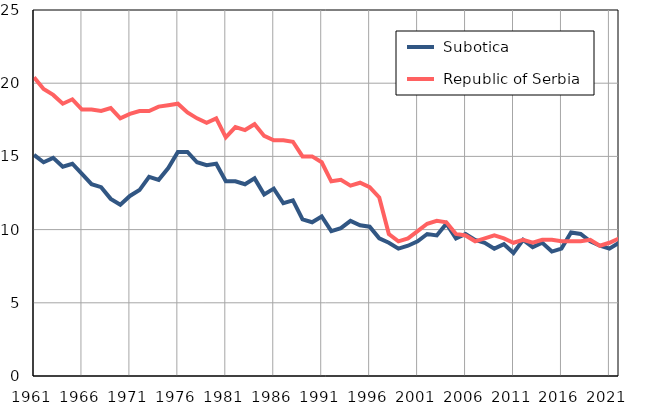
| Category |  Subotica |  Republic of Serbia |
|---|---|---|
| 1961.0 | 15.1 | 20.4 |
| 1962.0 | 14.6 | 19.6 |
| 1963.0 | 14.9 | 19.2 |
| 1964.0 | 14.3 | 18.6 |
| 1965.0 | 14.5 | 18.9 |
| 1966.0 | 13.8 | 18.2 |
| 1967.0 | 13.1 | 18.2 |
| 1968.0 | 12.9 | 18.1 |
| 1969.0 | 12.1 | 18.3 |
| 1970.0 | 11.7 | 17.6 |
| 1971.0 | 12.3 | 17.9 |
| 1972.0 | 12.7 | 18.1 |
| 1973.0 | 13.6 | 18.1 |
| 1974.0 | 13.4 | 18.4 |
| 1975.0 | 14.2 | 18.5 |
| 1976.0 | 15.3 | 18.6 |
| 1977.0 | 15.3 | 18 |
| 1978.0 | 14.6 | 17.6 |
| 1979.0 | 14.4 | 17.3 |
| 1980.0 | 14.5 | 17.6 |
| 1981.0 | 13.3 | 16.3 |
| 1982.0 | 13.3 | 17 |
| 1983.0 | 13.1 | 16.8 |
| 1984.0 | 13.5 | 17.2 |
| 1985.0 | 12.4 | 16.4 |
| 1986.0 | 12.8 | 16.1 |
| 1987.0 | 11.8 | 16.1 |
| 1988.0 | 12 | 16 |
| 1989.0 | 10.7 | 15 |
| 1990.0 | 10.5 | 15 |
| 1991.0 | 10.9 | 14.6 |
| 1992.0 | 9.9 | 13.3 |
| 1993.0 | 10.1 | 13.4 |
| 1994.0 | 10.6 | 13 |
| 1995.0 | 10.3 | 13.2 |
| 1996.0 | 10.2 | 12.9 |
| 1997.0 | 9.4 | 12.2 |
| 1998.0 | 9.1 | 9.7 |
| 1999.0 | 8.7 | 9.2 |
| 2000.0 | 8.9 | 9.4 |
| 2001.0 | 9.2 | 9.9 |
| 2002.0 | 9.7 | 10.4 |
| 2003.0 | 9.6 | 10.6 |
| 2004.0 | 10.4 | 10.5 |
| 2005.0 | 9.4 | 9.7 |
| 2006.0 | 9.7 | 9.6 |
| 2007.0 | 9.3 | 9.2 |
| 2008.0 | 9.1 | 9.4 |
| 2009.0 | 8.7 | 9.6 |
| 2010.0 | 9 | 9.4 |
| 2011.0 | 8.4 | 9.1 |
| 2012.0 | 9.3 | 9.3 |
| 2013.0 | 8.8 | 9.1 |
| 2014.0 | 9.1 | 9.3 |
| 2015.0 | 8.5 | 9.3 |
| 2016.0 | 8.7 | 9.2 |
| 2017.0 | 9.8 | 9.2 |
| 2018.0 | 9.7 | 9.2 |
| 2019.0 | 9.2 | 9.3 |
| 2020.0 | 8.9 | 8.9 |
| 2021.0 | 8.7 | 9.1 |
| 2022.0 | 9.1 | 9.4 |